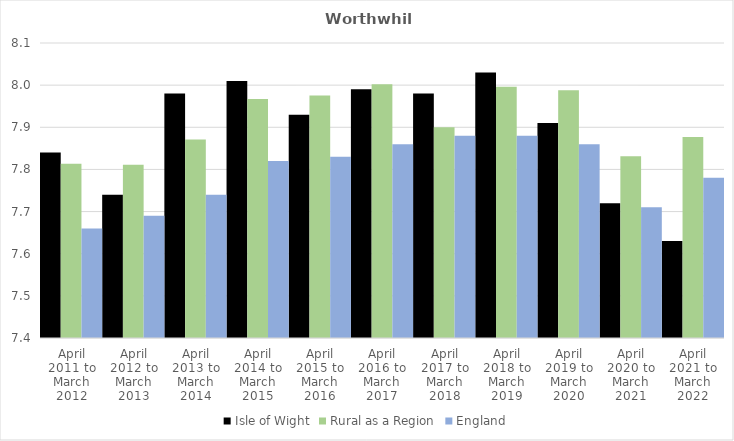
| Category | Isle of Wight | Rural as a Region | England |
|---|---|---|---|
| April 2011 to March 2012 | 7.84 | 7.813 | 7.66 |
| April 2012 to March 2013 | 7.74 | 7.811 | 7.69 |
| April 2013 to March 2014 | 7.98 | 7.871 | 7.74 |
| April 2014 to March 2015 | 8.01 | 7.967 | 7.82 |
| April 2015 to March 2016 | 7.93 | 7.975 | 7.83 |
| April 2016 to March 2017 | 7.99 | 8.002 | 7.86 |
| April 2017 to March 2018 | 7.98 | 7.9 | 7.88 |
| April 2018 to March 2019 | 8.03 | 7.996 | 7.88 |
| April 2019 to March 2020 | 7.91 | 7.988 | 7.86 |
| April 2020 to March 2021 | 7.72 | 7.831 | 7.71 |
| April 2021 to March 2022 | 7.63 | 7.877 | 7.78 |